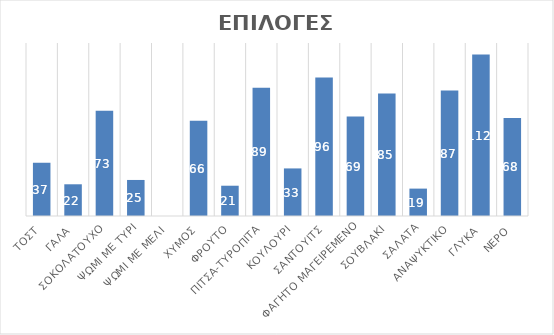
| Category | ΕΠΙΛΟΓΕΣ ΠΑΙΔΙΩΝ |
|---|---|
| ΤΟΣΤ | 37 |
| ΓΑΛΑ | 22 |
| ΣΟΚΟΛΑΤΟΥΧΟ | 73 |
| ΨΩΜΙ ΜΕ ΤΥΡΙ | 25 |
| ΨΩΜΙ ΜΕ ΜΕΛΙ | 0 |
| ΧΥΜΟΣ | 66 |
| ΦΡΟΥΤΟ | 21 |
| ΠΙΤΣΑ-ΤΥΡΟΠΙΤΑ | 89 |
| ΚΟΥΛΟΥΡΙ | 33 |
| ΣΑΝΤΟΥΙΤΣ | 96 |
| ΦΑΓΗΤΟ ΜΑΓΕΙΡΕΜΕΝΟ | 69 |
| ΣΟΥΒΛΑΚΙ | 85 |
| ΣΑΛΑΤΑ | 19 |
| ΑΝΑΨΥΚΤΙΚΟ | 87 |
| ΓΛΥΚΑ | 112 |
| ΝΕΡΟ | 68 |